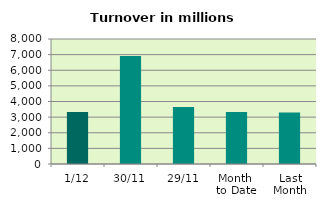
| Category | Series 0 |
|---|---|
| 1/12 | 3328.986 |
| 30/11 | 6909.705 |
| 29/11 | 3654.429 |
| Month 
to Date | 3328.986 |
| Last
Month | 3292.145 |